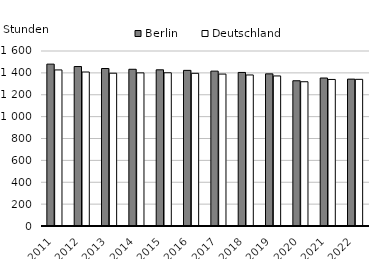
| Category | Berlin | Deutschland |
|---|---|---|
| 2011.0 | 1480 | 1427 |
| 2012.0 | 1458 | 1408 |
| 2013.0 | 1440 | 1397 |
| 2014.0 | 1433 | 1400 |
| 2015.0 | 1428 | 1401 |
| 2016.0 | 1423 | 1396 |
| 2017.0 | 1416 | 1389 |
| 2018.0 | 1404 | 1381 |
| 2019.0 | 1391 | 1372 |
| 2020.0 | 1328 | 1319 |
| 2021.0 | 1353 | 1340 |
| 2022.0 | 1343 | 1341 |